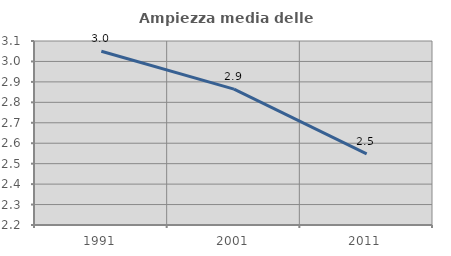
| Category | Ampiezza media delle famiglie |
|---|---|
| 1991.0 | 3.05 |
| 2001.0 | 2.865 |
| 2011.0 | 2.548 |